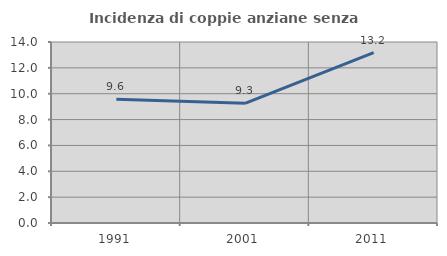
| Category | Incidenza di coppie anziane senza figli  |
|---|---|
| 1991.0 | 9.576 |
| 2001.0 | 9.253 |
| 2011.0 | 13.172 |